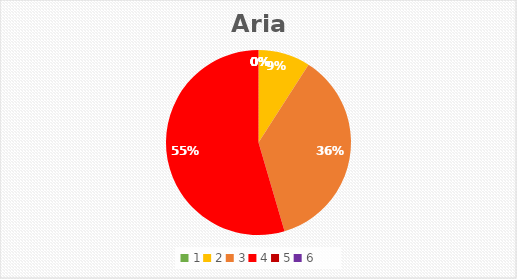
| Category | Series 0 |
|---|---|
| 0 | 0 |
| 1 | 3 |
| 2 | 12 |
| 3 | 18 |
| 4 | 0 |
| 5 | 0 |